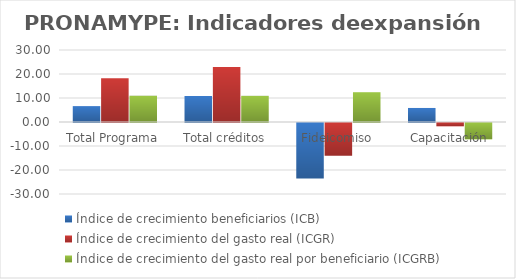
| Category | Índice de crecimiento beneficiarios (ICB)  | Índice de crecimiento del gasto real (ICGR)  | Índice de crecimiento del gasto real por beneficiario (ICGRB)  |
|---|---|---|---|
| Total Programa | 6.619 | 18.278 | 10.935 |
| Total créditos | 10.846 | 22.925 | 10.897 |
| Fideicomiso | -23.162 | -13.624 | 12.412 |
| Capacitación | 5.847 | -1.393 | -6.84 |